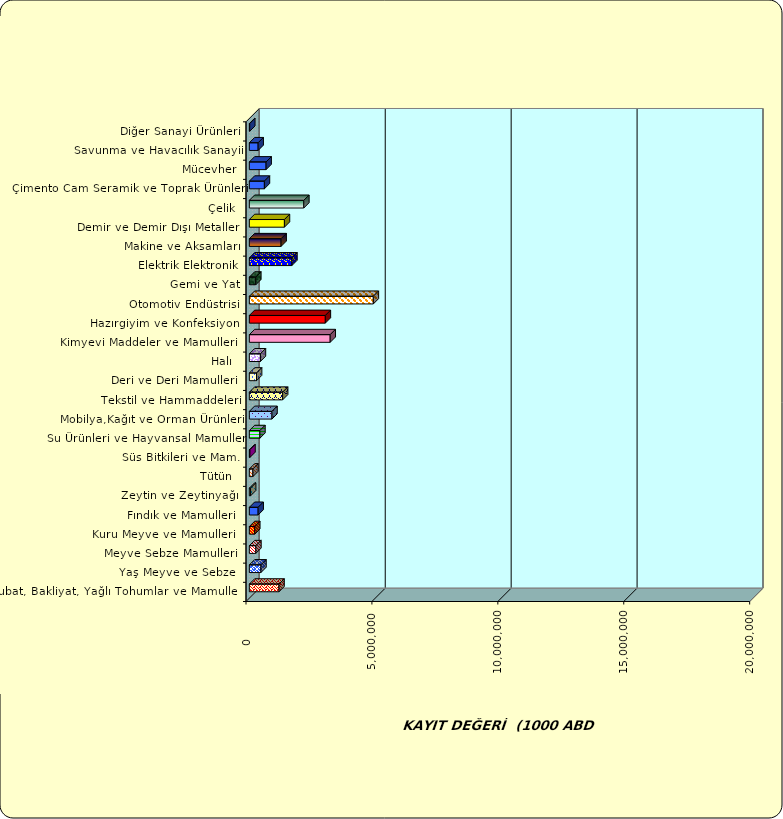
| Category | Series 0 |
|---|---|
|  Hububat, Bakliyat, Yağlı Tohumlar ve Mamulleri  | 1178078.657 |
|  Yaş Meyve ve Sebze   | 460206.867 |
|  Meyve Sebze Mamulleri  | 259005.655 |
|  Kuru Meyve ve Mamulleri   | 214110.139 |
|  Fındık ve Mamulleri  | 348446.534 |
|  Zeytin ve Zeytinyağı  | 49287.906 |
|  Tütün  | 140015.754 |
|  Süs Bitkileri ve Mam. | 24210.724 |
|  Su Ürünleri ve Hayvansal Mamuller | 418911.447 |
|  Mobilya,Kağıt ve Orman Ürünleri | 898615.49 |
|  Tekstil ve Hammaddeleri | 1321055.087 |
|  Deri ve Deri Mamulleri  | 285763.741 |
|  Halı  | 438569.639 |
|  Kimyevi Maddeler ve Mamulleri   | 3210453.13 |
|  Hazırgiyim ve Konfeksiyon  | 3017403.478 |
|  Otomotiv Endüstrisi | 4923389.4 |
|  Gemi ve Yat | 256334.524 |
|  Elektrik Elektronik | 1689279.98 |
|  Makine ve Aksamları | 1260791.466 |
|  Demir ve Demir Dışı Metaller  | 1392975.7 |
|  Çelik | 2162668.252 |
|  Çimento Cam Seramik ve Toprak Ürünleri | 597803.633 |
|  Mücevher | 664298.24 |
|  Savunma ve Havacılık Sanayii | 348697.133 |
|  Diğer Sanayi Ürünleri | 15712.484 |